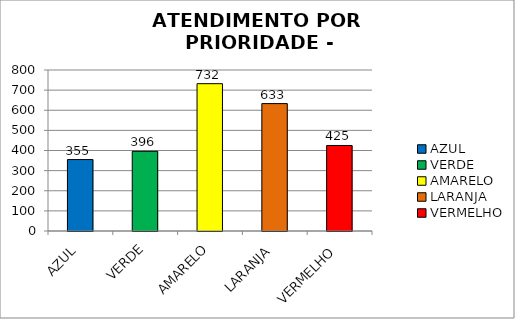
| Category | Total Regional: |
|---|---|
| AZUL | 355 |
| VERDE | 396 |
| AMARELO | 732 |
| LARANJA | 633 |
| VERMELHO | 425 |